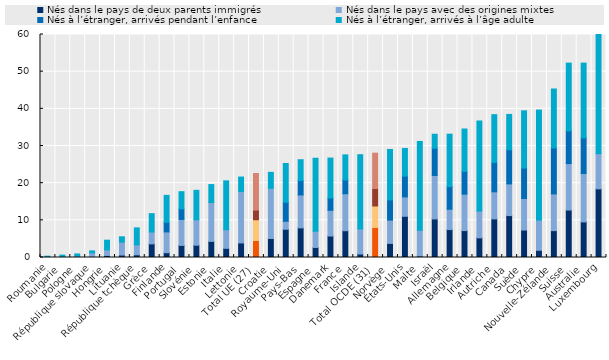
| Category | Nés dans le pays de deux parents immigrés | Nés dans le pays avec des origines mixtes | Nés à l’étranger, arrivés pendant l’enfance | Nés à l’étranger, arrivés à l’âge adulte |
|---|---|---|---|---|
| Roumanie | 0.003 | 0.071 | 0 | 0.283 |
| Bulgarie | 0.017 | 0.249 | 0 | 0.375 |
| Pologne | 0.046 | 0.291 | 0 | 0.612 |
| République slovaque | 0.104 | 1.145 | 0 | 0.539 |
| Hongrie | 0.555 | 1.497 | 0 | 2.604 |
| Lituanie | 0.659 | 3.475 | 0 | 1.432 |
| République tchèque | 0.729 | 2.676 | 0 | 4.568 |
| Grèce | 3.672 | 3.193 | 0 | 4.925 |
| Finlande | 1.282 | 5.596 | 2.583 | 7.263 |
| Portugal | 3.249 | 7.001 | 2.82 | 4.638 |
| Slovénie | 3.305 | 6.851 | 0 | 7.911 |
| Estonie | 4.335 | 10.466 | 0 | 4.818 |
| Italie | 2.473 | 5.003 | 0 | 13.146 |
| Lettonie | 3.919 | 13.84 | 0 | 3.889 |
| Total UE (27) | 4.572 | 5.589 | 2.602 | 9.838 |
| Croatie | 5.105 | 13.513 | 0 | 4.291 |
| Royaume-Uni | 7.597 | 2.144 | 5.12 | 10.434 |
| Pays-Bas | 7.971 | 8.854 | 3.881 | 5.601 |
| Espagne | 2.7 | 4.37 | 0 | 19.634 |
| Danemark | 5.775 | 6.928 | 3.27 | 10.777 |
| France | 7.216 | 9.943 | 3.698 | 6.758 |
| Islande | 0.945 | 6.738 | 0 | 19.977 |
| Total OCDE (31) | 8.084 | 5.775 | 4.704 | 9.51 |
| Norvège | 3.798 | 6.268 | 5.422 | 13.584 |
| États-Unis | 11.09 | 5.217 | 5.587 | 7.449 |
| Malte | 0.39 | 6.933 | 0 | 23.9 |
| Israël | 10.375 | 11.704 | 7.325 | 3.756 |
| Allemagne | 7.513 | 5.471 | 6.09 | 14.103 |
| Belgique | 7.239 | 9.811 | 6.123 | 11.399 |
| Irlande | 5.288 | 7.198 | 0 | 24.244 |
| Autriche | 10.388 | 7.289 | 7.866 | 12.889 |
| Canada | 11.279 | 8.525 | 9.179 | 9.511 |
| Suède | 7.381 | 8.492 | 8.184 | 15.405 |
| Chypre | 1.946 | 8.119 | 0 | 29.601 |
| Nouvelle-Zélande | 7.232 | 9.876 | 12.364 | 15.863 |
| Suisse | 12.763 | 12.509 | 8.806 | 18.225 |
| Australie | 9.576 | 13.025 | 9.565 | 20.141 |
| Luxembourg | 18.477 | 9.45 | 0 | 49.183 |